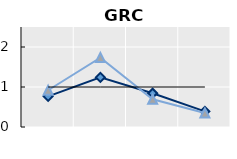
| Category | Foreign-born | Native-born | Series 1 |
|---|---|---|---|
| 15-24 | 0.767 | 0.919 | 1 |
| 25-54 | 1.24 | 1.735 | 1 |
| 55-64 | 0.845 | 0.692 | 1 |
| 65+ | 0.391 | 0.349 | 1 |